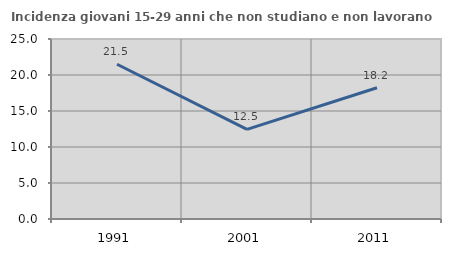
| Category | Incidenza giovani 15-29 anni che non studiano e non lavorano  |
|---|---|
| 1991.0 | 21.497 |
| 2001.0 | 12.457 |
| 2011.0 | 18.229 |